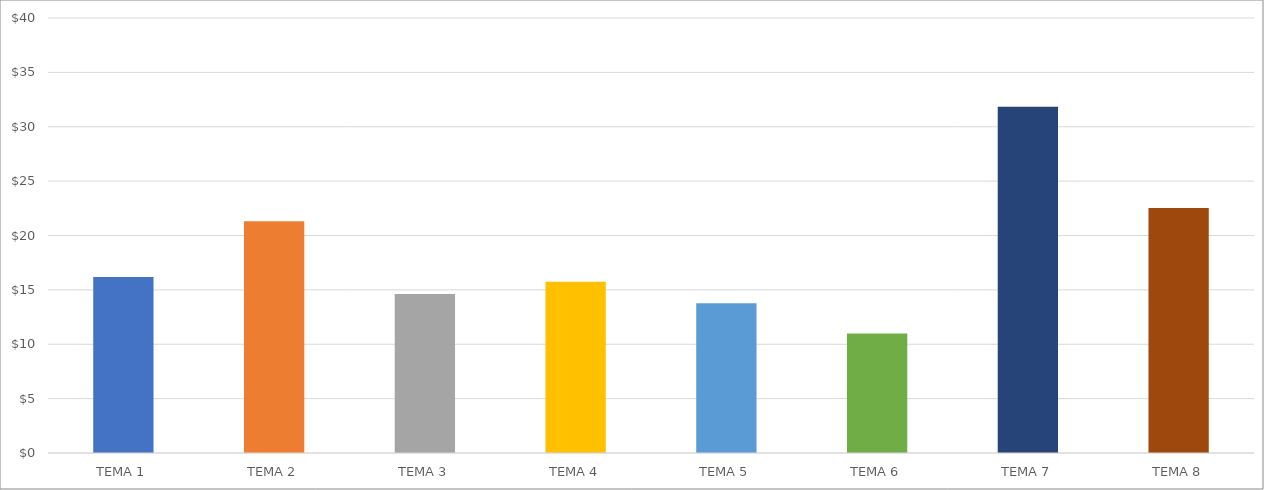
| Category | BENEFICIO POR ARTÍCULO |
|---|---|
| TEMA 1 | 16.185 |
| TEMA 2 | 21.315 |
| TEMA 3 | 14.625 |
| TEMA 4 | 15.75 |
| TEMA 5 | 13.775 |
| TEMA 6 | 11 |
| TEMA 7 | 31.85 |
| TEMA 8 | 22.54 |